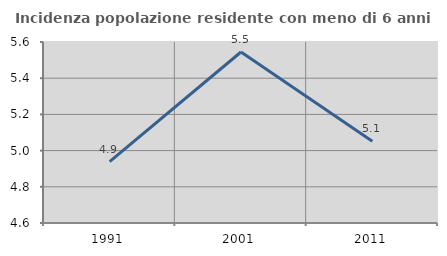
| Category | Incidenza popolazione residente con meno di 6 anni |
|---|---|
| 1991.0 | 4.939 |
| 2001.0 | 5.545 |
| 2011.0 | 5.052 |